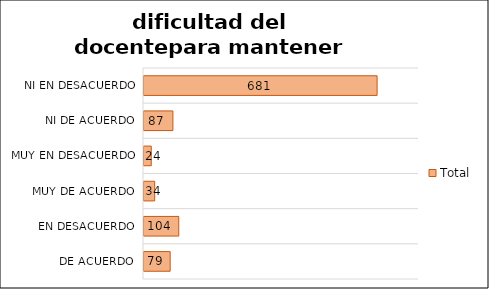
| Category | Total |
|---|---|
| De acuerdo | 79 |
| En desacuerdo | 104 |
| Muy de Acuerdo | 34 |
| Muy en desacuerdo | 24 |
| Ni de acuerdo, ni en desacuerdo | 87 |
| No responde | 681 |